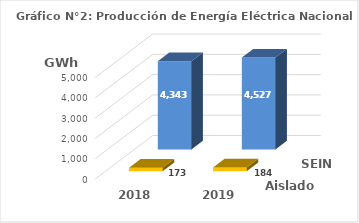
| Category | Aislados | SEIN |
|---|---|---|
| 2018.0 | 172.767 | 4343.206 |
| 2019.0 | 183.593 | 4526.625 |